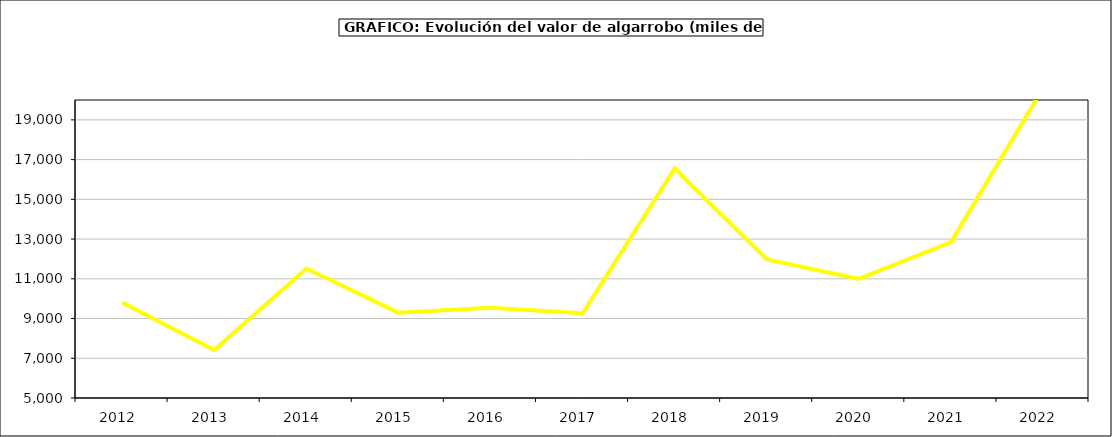
| Category | producción |
|---|---|
| 2012.0 | 9804.883 |
| 2013.0 | 7410.909 |
| 2014.0 | 11518 |
| 2015.0 | 9297 |
| 2016.0 | 9540 |
| 2017.0 | 9266.566 |
| 2018.0 | 16561.827 |
| 2019.0 | 11974.589 |
| 2020.0 | 10995.99 |
| 2021.0 | 12847.206 |
| 2022.0 | 20597.782 |